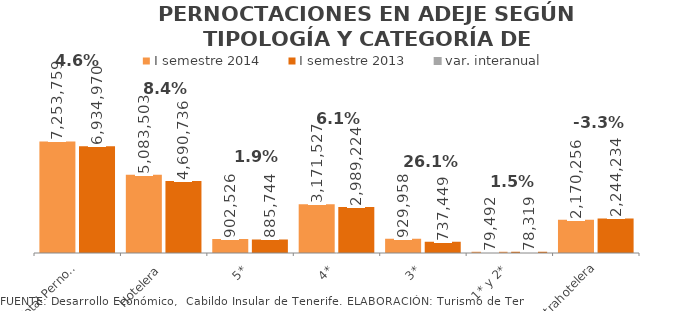
| Category | I semestre 2014 | I semestre 2013 |
|---|---|---|
| Total Pernoctaciones | 7253759 | 6934970 |
| Hotelera | 5083503 | 4690736 |
| 5* | 902526 | 885744 |
| 4* | 3171527 | 2989224 |
| 3* | 929958 | 737449 |
| 1* y 2* | 79492 | 78319 |
| Extrahotelera | 2170256 | 2244234 |